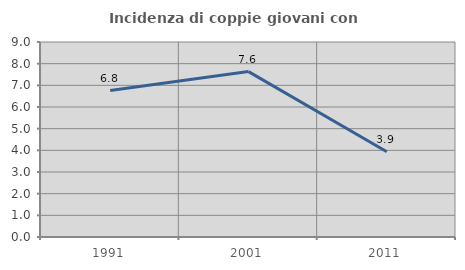
| Category | Incidenza di coppie giovani con figli |
|---|---|
| 1991.0 | 6.757 |
| 2001.0 | 7.634 |
| 2011.0 | 3.937 |